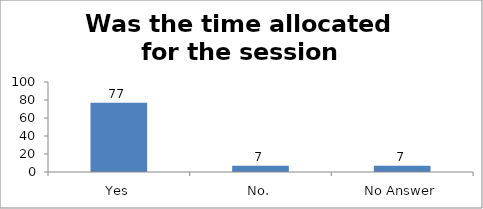
| Category | Was the time allocated for the session sufficient? |
|---|---|
| Yes | 77 |
| No. | 7 |
| No Answer | 7 |